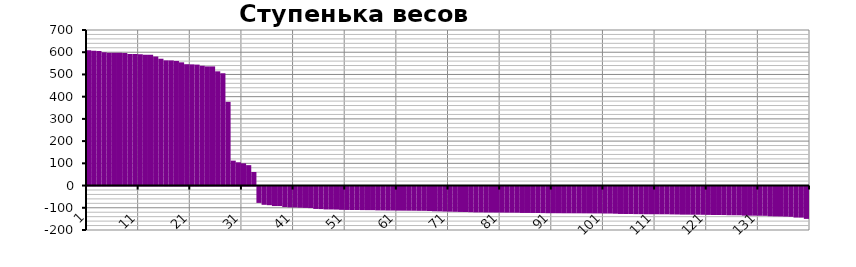
| Category | Series 0 |
|---|---|
| 0 | 608.8 |
| 1 | 606.4 |
| 2 | 605.6 |
| 3 | 600.2 |
| 4 | 598.1 |
| 5 | 598.1 |
| 6 | 598.1 |
| 7 | 596.4 |
| 8 | 592.5 |
| 9 | 592 |
| 10 | 591.1 |
| 11 | 588.5 |
| 12 | 588.3 |
| 13 | 580.7 |
| 14 | 570.1 |
| 15 | 563.5 |
| 16 | 563.2 |
| 17 | 560.9 |
| 18 | 554.4 |
| 19 | 546.1 |
| 20 | 545.4 |
| 21 | 544.3 |
| 22 | 539 |
| 23 | 536.2 |
| 24 | 536.2 |
| 25 | 514 |
| 26 | 505.4 |
| 27 | 376.6 |
| 28 | 112.1 |
| 29 | 104.6 |
| 30 | 99.9 |
| 31 | 91.8 |
| 32 | 61.1 |
| 33 | -73.6 |
| 34 | -82.1 |
| 35 | -83.8 |
| 36 | -87.8 |
| 37 | -87.8 |
| 38 | -92.3 |
| 39 | -93.7 |
| 40 | -94 |
| 41 | -95.1 |
| 42 | -96 |
| 43 | -97 |
| 44 | -100.7 |
| 45 | -101.4 |
| 46 | -103 |
| 47 | -103.1 |
| 48 | -103.6 |
| 49 | -104.9 |
| 50 | -105.3 |
| 51 | -105.5 |
| 52 | -105.5 |
| 53 | -105.9 |
| 54 | -106.1 |
| 55 | -106.1 |
| 56 | -107.2 |
| 57 | -107.3 |
| 58 | -107.8 |
| 59 | -107.8 |
| 60 | -108.3 |
| 61 | -108.4 |
| 62 | -108.6 |
| 63 | -108.7 |
| 64 | -109.2 |
| 65 | -109.2 |
| 66 | -110 |
| 67 | -111.3 |
| 68 | -111.7 |
| 69 | -112.6 |
| 70 | -113.1 |
| 71 | -113.6 |
| 72 | -114.3 |
| 73 | -114.4 |
| 74 | -115.4 |
| 75 | -116.3 |
| 76 | -116.3 |
| 77 | -116.8 |
| 78 | -116.9 |
| 79 | -117.1 |
| 80 | -117.1 |
| 81 | -117.4 |
| 82 | -117.5 |
| 83 | -117.7 |
| 84 | -118.7 |
| 85 | -118.7 |
| 86 | -118.8 |
| 87 | -119.1 |
| 88 | -119.5 |
| 89 | -120 |
| 90 | -120 |
| 91 | -120.1 |
| 92 | -120.3 |
| 93 | -120.3 |
| 94 | -120.4 |
| 95 | -120.4 |
| 96 | -120.6 |
| 97 | -120.7 |
| 98 | -120.9 |
| 99 | -120.9 |
| 100 | -121.4 |
| 101 | -121.4 |
| 102 | -122.2 |
| 103 | -123.3 |
| 104 | -123.4 |
| 105 | -123.5 |
| 106 | -124.1 |
| 107 | -124.2 |
| 108 | -124.6 |
| 109 | -124.6 |
| 110 | -124.6 |
| 111 | -124.8 |
| 112 | -124.8 |
| 113 | -125.4 |
| 114 | -125.7 |
| 115 | -126.4 |
| 116 | -126.4 |
| 117 | -126.6 |
| 118 | -126.6 |
| 119 | -127 |
| 120 | -127.5 |
| 121 | -128.1 |
| 122 | -128.1 |
| 123 | -128.2 |
| 124 | -129 |
| 125 | -129.1 |
| 126 | -129.2 |
| 127 | -130.9 |
| 128 | -131.1 |
| 129 | -131.1 |
| 130 | -131.4 |
| 131 | -131.7 |
| 132 | -133.6 |
| 133 | -134.3 |
| 134 | -134.6 |
| 135 | -135.4 |
| 136 | -136.2 |
| 137 | -139.5 |
| 138 | -139.8 |
| 139 | -145.5 |